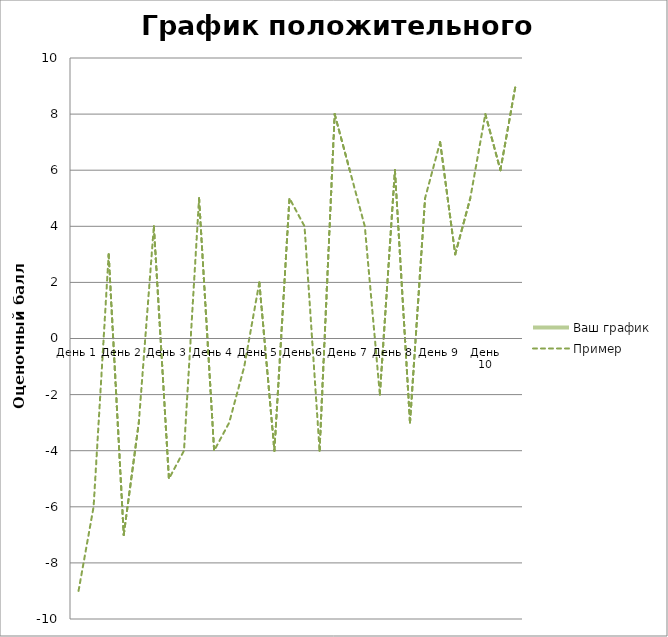
| Category | Ваш график | Пример |
|---|---|---|
| День 1 |  | -9 |
|  |  | -6 |
|  |  | 3 |
| День 2 |  | -7 |
|  |  | -3 |
|  |  | 4 |
| День 3 |  | -5 |
|  |  | -4 |
|  |  | 5 |
| День 4 |  | -4 |
|  |  | -3 |
|  |  | -1 |
| День 5 |  | 2 |
|  |  | -4 |
|  |  | 5 |
| День 6 |  | 4 |
|  |  | -4 |
|  |  | 8 |
| День 7 |  | 6 |
|  |  | 4 |
|  |  | -2 |
| День 8 |  | 6 |
|  |  | -3 |
|  |  | 5 |
| День 9 |  | 7 |
|  |  | 3 |
|  |  | 5 |
| День 10 |  | 8 |